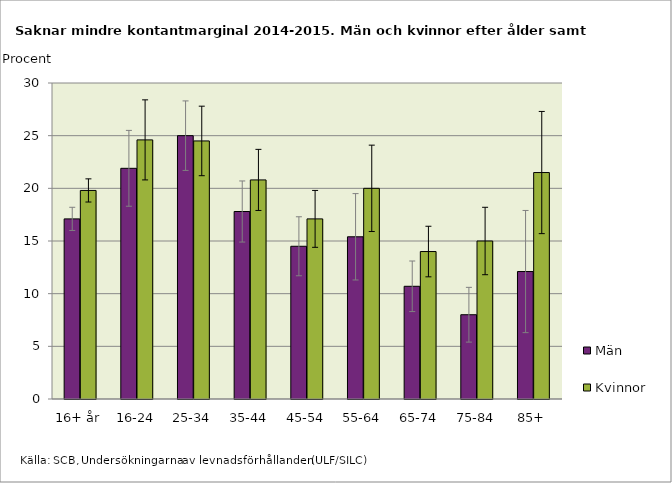
| Category | Män | Kvinnor |
|---|---|---|
| 16+ år | 17.1 | 19.8 |
| 16-24 | 21.9 | 24.6 |
| 25-34 | 25 | 24.5 |
| 35-44 | 17.8 | 20.8 |
| 45-54 | 14.5 | 17.1 |
| 55-64 | 15.4 | 20 |
| 65-74 | 10.7 | 14 |
| 75-84 | 8 | 15 |
| 85+ | 12.1 | 21.5 |